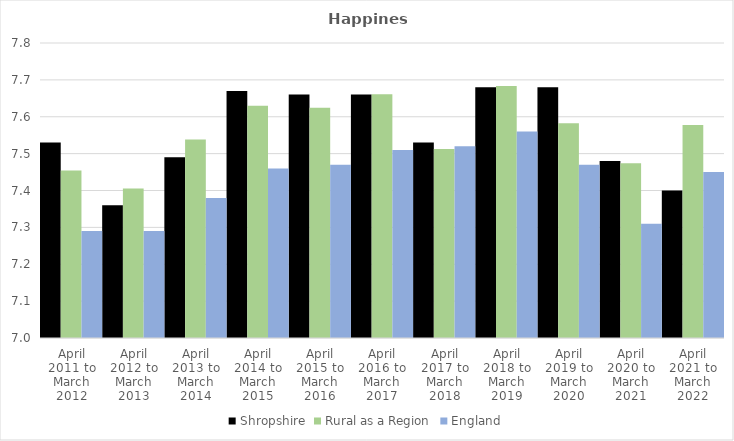
| Category | Shropshire | Rural as a Region | England |
|---|---|---|---|
| April 2011 to March 2012 | 7.53 | 7.454 | 7.29 |
| April 2012 to March 2013 | 7.36 | 7.406 | 7.29 |
| April 2013 to March 2014 | 7.49 | 7.539 | 7.38 |
| April 2014 to March 2015 | 7.67 | 7.63 | 7.46 |
| April 2015 to March 2016 | 7.66 | 7.625 | 7.47 |
| April 2016 to March 2017 | 7.66 | 7.661 | 7.51 |
| April 2017 to March 2018 | 7.53 | 7.513 | 7.52 |
| April 2018 to March 2019 | 7.68 | 7.684 | 7.56 |
| April 2019 to March 2020 | 7.68 | 7.582 | 7.47 |
| April 2020 to March 2021 | 7.48 | 7.474 | 7.31 |
| April 2021 to March 2022 | 7.4 | 7.577 | 7.45 |